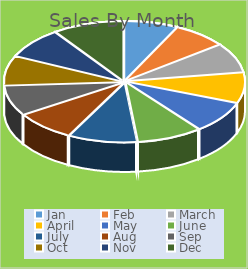
| Category | Series 0 | Series 1 | Series 2 | Series 3 |
|---|---|---|---|---|
| Jan | 91874.78 |  |  |  |
| Feb | 92086.75 |  |  |  |
| March | 101052.99 |  |  |  |
| April | 103285.23 |  |  |  |
| May | 108114.86 |  |  |  |
| June | 112030.61 |  |  |  |
| July | 117994.92 |  |  |  |
| Aug | 103632.79 |  |  |  |
| Sep | 102738.21 |  |  |  |
| Oct | 100098.88 |  |  |  |
| Nov | 104297.41 |  |  |  |
| Dec | 121723.87 |  |  |  |